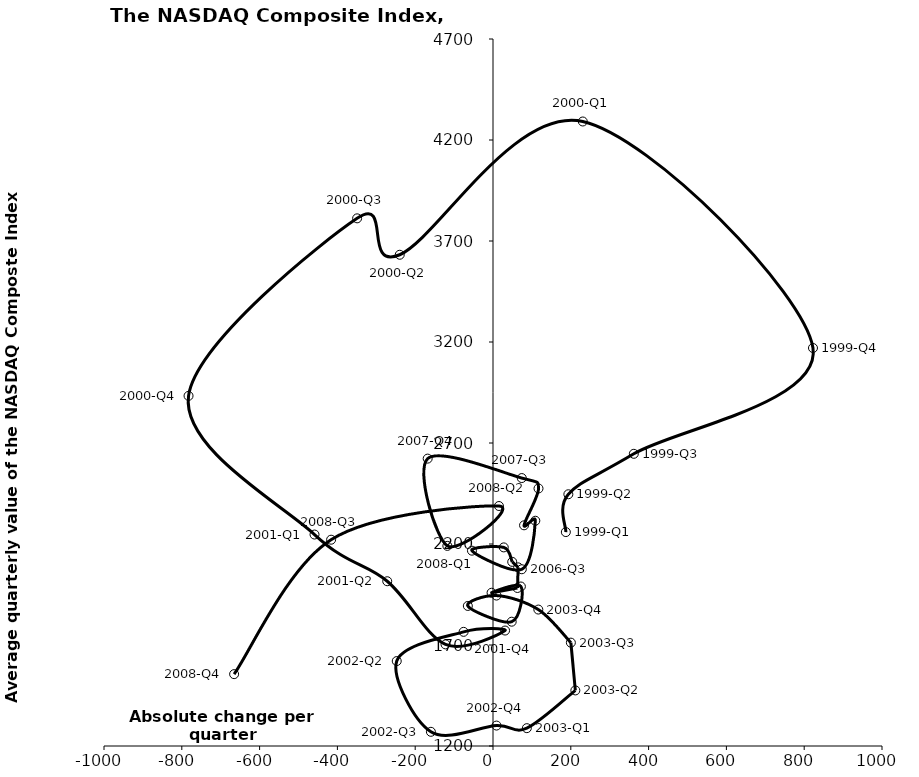
| Category | Series 0 |
|---|---|
| 187.26755769230704 | 2259.019 |
| 193.72774621212102 | 2446.286 |
| 362.00578554778554 | 2646.474 |
| 822.5784941724946 | 3170.298 |
| 230.81082983682973 | 4291.631 |
| -239.73199999999997 | 3631.92 |
| -349.3135384615384 | 3812.167 |
| -782.6793076923077 | 2933.292 |
| -458.82699999999977 | 2246.809 |
| -271.8920769230774 | 2015.638 |
| -122.03612470862493 | 1703.024 |
| 31.048003605769395 | 1771.566 |
| -75.55049067599032 | 1765.12 |
| -247.43000710227307 | 1620.465 |
| -159.64784265734284 | 1270.26 |
| 9.020553977273153 | 1301.17 |
| 86.9618426573428 | 1288.302 |
| 211.70323390151486 | 1475.093 |
| 200.18800582750578 | 1711.708 |
| 116.5069848484851 | 1875.469 |
| 8.958686480186202 | 1944.722 |
| -64.67842424242463 | 1893.387 |
| 48.10419230769253 | 1815.365 |
| 71.66078361742439 | 1989.595 |
| -3.6798846153845943 | 1958.687 |
| 62.85467092803037 | 1982.235 |
| 64.700307692308 | 2084.396 |
| 49.38173892773898 | 2111.636 |
| 27.67569230769209 | 2183.16 |
| -54.105461538461896 | 2166.987 |
| 74.08100000000013 | 2074.949 |
| 108.78692307692359 | 2315.149 |
| 79.82369230769177 | 2292.522 |
| 116.96953846153883 | 2474.797 |
| 73.96063170163211 | 2526.462 |
| -167.90123076923146 | 2622.718 |
| -117.33747785547757 | 2190.659 |
| 15.29849184149225 | 2388.043 |
| -416.15661305361334 | 2221.256 |
| -665.5263636363641 | 1555.73 |